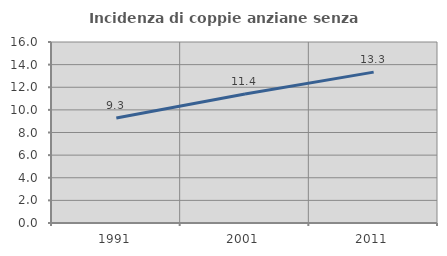
| Category | Incidenza di coppie anziane senza figli  |
|---|---|
| 1991.0 | 9.278 |
| 2001.0 | 11.405 |
| 2011.0 | 13.337 |